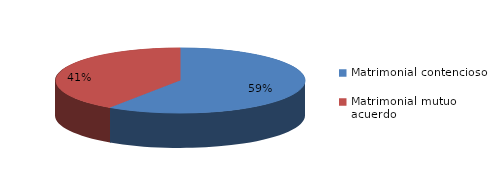
| Category | Series 0 |
|---|---|
| 0 | 755 |
| 1 | 515 |